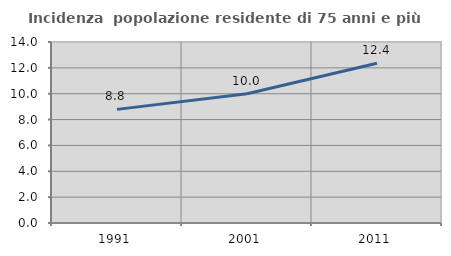
| Category | Incidenza  popolazione residente di 75 anni e più |
|---|---|
| 1991.0 | 8.788 |
| 2001.0 | 10.002 |
| 2011.0 | 12.354 |